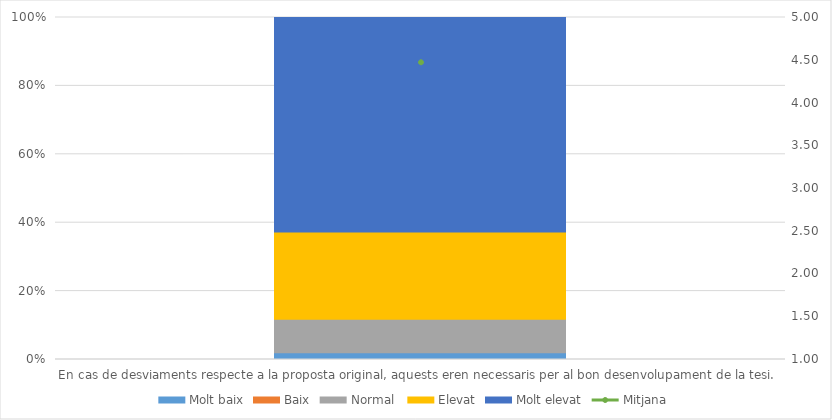
| Category | Molt baix | Baix | Normal  | Elevat | Molt elevat |
|---|---|---|---|---|---|
| En cas de desviaments respecte a la proposta original, aquests eren necessaris per al bon desenvolupament de la tesi. | 1 | 0 | 5 | 13 | 32 |